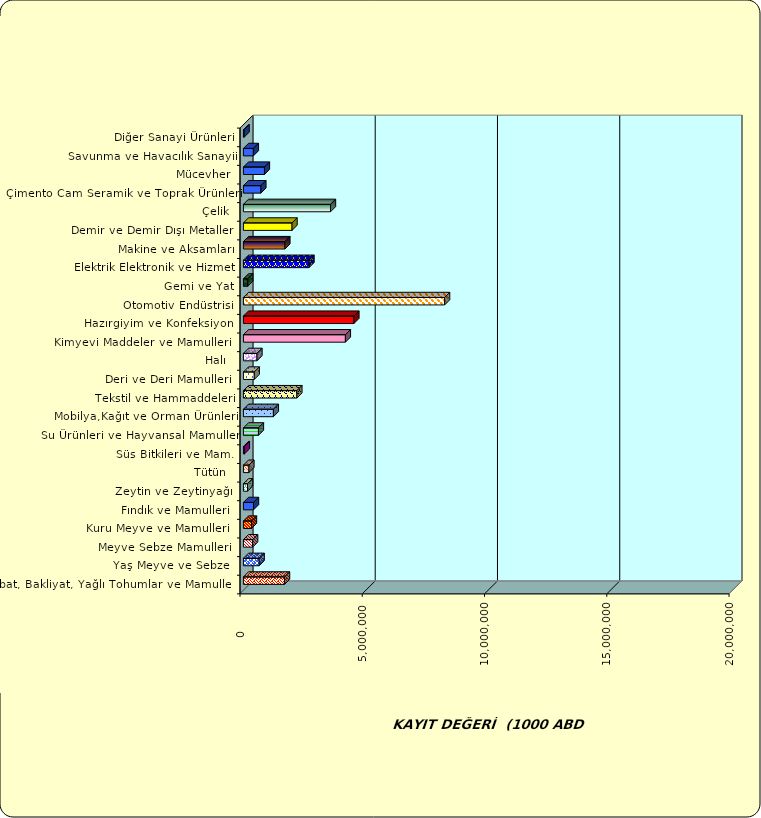
| Category | Series 0 |
|---|---|
|  Hububat, Bakliyat, Yağlı Tohumlar ve Mamulleri  | 1683367.888 |
|  Yaş Meyve ve Sebze   | 645256.22 |
|  Meyve Sebze Mamulleri  | 379159.605 |
|  Kuru Meyve ve Mamulleri   | 331668.193 |
|  Fındık ve Mamulleri  | 413786.916 |
|  Zeytin ve Zeytinyağı  | 169013.614 |
|  Tütün  | 226354.953 |
|  Süs Bitkileri ve Mam. | 41887.121 |
|  Su Ürünleri ve Hayvansal Mamuller | 615519.022 |
|  Mobilya,Kağıt ve Orman Ürünleri | 1226042.044 |
|  Tekstil ve Hammaddeleri | 2187268.334 |
|  Deri ve Deri Mamulleri  | 443952.473 |
|  Halı  | 554277.108 |
|  Kimyevi Maddeler ve Mamulleri   | 4170483.638 |
|  Hazırgiyim ve Konfeksiyon  | 4520217.395 |
|  Otomotiv Endüstrisi | 8228175.36 |
|  Gemi ve Yat | 178222.113 |
|  Elektrik Elektronik ve Hizmet | 2682134.622 |
|  Makine ve Aksamları | 1697148.795 |
|  Demir ve Demir Dışı Metaller  | 1988267.585 |
|  Çelik | 3562443.487 |
|  Çimento Cam Seramik ve Toprak Ürünleri | 715380.259 |
|  Mücevher | 860527.417 |
|  Savunma ve Havacılık Sanayii | 407894.679 |
|  Diğer Sanayi Ürünleri | 29491.463 |